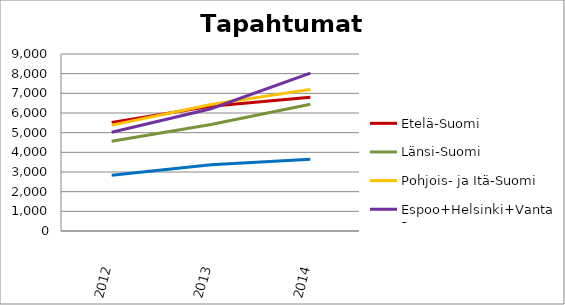
| Category | Etelä-Suomi | Länsi-Suomi | Pohjois- ja Itä-Suomi | Espoo+Helsinki+Vantaa | Muu Uusimaa |
|---|---|---|---|---|---|
| 2012.0 | 5524 | 4568 | 5382 | 5019 | 2840 |
| 2013.0 | 6343 | 5418 | 6434 | 6217 | 3364 |
| 2014.0 | 6798 | 6445 | 7202 | 8032 | 3647 |